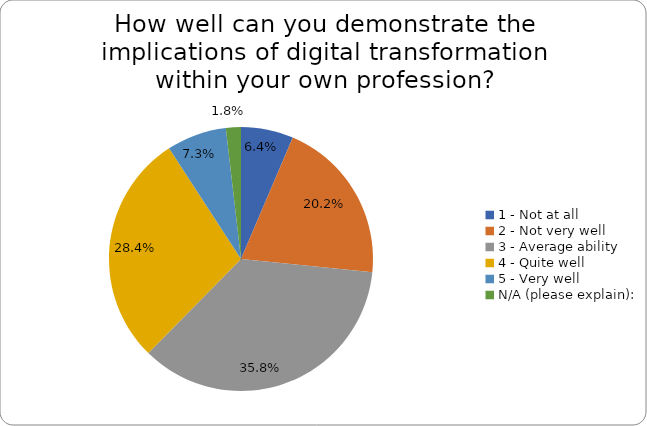
| Category | Series 0 |
|---|---|
| 1 - Not at all | 0.064 |
| 2 - Not very well | 0.202 |
| 3 - Average ability | 0.358 |
| 4 - Quite well | 0.284 |
| 5 - Very well | 0.073 |
| N/A (please explain): | 0.018 |